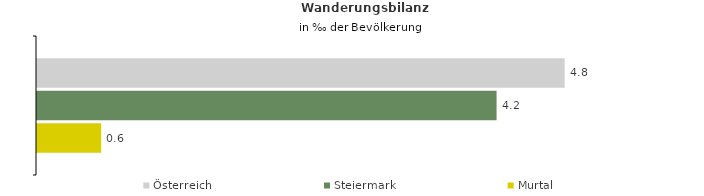
| Category | Österreich | Steiermark | Murtal |
|---|---|---|---|
| Wanderungsrate in ‰ der Bevölkerung, Periode 2017-2021 | 4.789 | 4.172 | 0.583 |